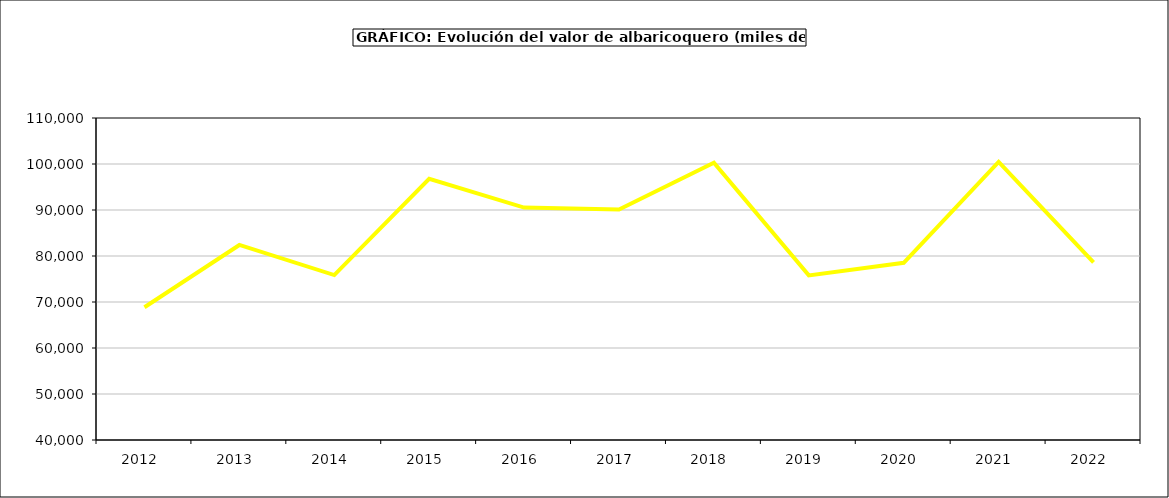
| Category | valor albaricoquero |
|---|---|
| 2012.0 | 68866.776 |
| 2013.0 | 82399.533 |
| 2014.0 | 75850.331 |
| 2015.0 | 96779 |
| 2016.0 | 90534 |
| 2017.0 | 90084.503 |
| 2018.0 | 100255.554 |
| 2019.0 | 75785.772 |
| 2020.0 | 78520.982 |
| 2021.0 | 100477.246 |
| 2022.0 | 78611.808 |